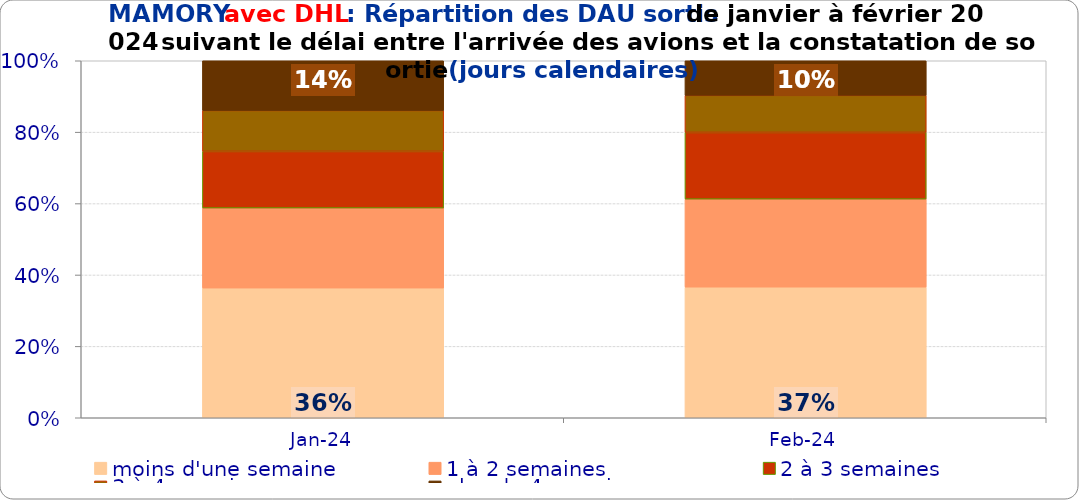
| Category | moins d'une semaine | 1 à 2 semaines | 2 à 3 semaines | 3 à 4 semaines | plus de 4 semaines |
|---|---|---|---|---|---|
| 2024-01-01 | 0.363 | 0.224 | 0.159 | 0.115 | 0.139 |
| 2024-02-01 | 0.366 | 0.247 | 0.187 | 0.104 | 0.097 |